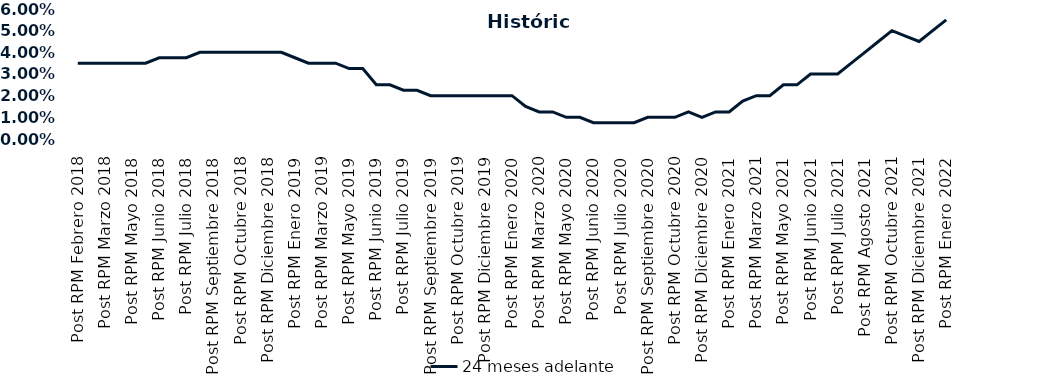
| Category | 24 meses adelante  |
|---|---|
| Post RPM Febrero 2018 | 0.035 |
| Pre RPM Marzo 2018 | 0.035 |
| Post RPM Marzo 2018 | 0.035 |
| Pre RPM Mayo 2018 | 0.035 |
| Post RPM Mayo 2018 | 0.035 |
| Pre RPM Junio 2018 | 0.035 |
| Post RPM Junio 2018 | 0.038 |
| Pre RPM Julio 2018 | 0.038 |
| Post RPM Julio 2018 | 0.038 |
| Pre RPM Septiembre 2018 | 0.04 |
| Post RPM Septiembre 2018 | 0.04 |
| Pre RPM Octubre 2018 | 0.04 |
| Post RPM Octubre 2018 | 0.04 |
| Pre RPM Diciembre 2018 | 0.04 |
| Post RPM Diciembre 2018 | 0.04 |
| Pre RPM Enero 2019 | 0.04 |
| Post RPM Enero 2019 | 0.038 |
| Pre RPM Marzo 2019 | 0.035 |
| Post RPM Marzo 2019 | 0.035 |
| Pre RPM Mayo 2019 | 0.035 |
| Post RPM Mayo 2019 | 0.032 |
| Pre RPM Junio 2019 | 0.032 |
| Post RPM Junio 2019 | 0.025 |
| Pre RPM Julio 2019 | 0.025 |
| Post RPM Julio 2019 | 0.022 |
| Pre RPM Septiembre 2019 | 0.022 |
| Post RPM Septiembre 2019 | 0.02 |
| Pre RPM Octubre 2019 | 0.02 |
| Post RPM Octubre 2019 | 0.02 |
| Pre RPM Diciembre 2019 | 0.02 |
| Post RPM Diciembre 2019 | 0.02 |
| Pre RPM Enero 2020 | 0.02 |
| Post RPM Enero 2020 | 0.02 |
| Pre RPM Marzo 2020 | 0.015 |
| Post RPM Marzo 2020 | 0.012 |
| Pre RPM Mayo 2020 | 0.012 |
| Post RPM Mayo 2020 | 0.01 |
| Pre RPM Junio 2020 | 0.01 |
| Post RPM Junio 2020 | 0.008 |
| Pre RPM Julio 2020 | 0.008 |
| Post RPM Julio 2020 | 0.008 |
| Pre RPM Septiembre 2020 | 0.008 |
| Post RPM Septiembre 2020 | 0.01 |
| Pre RPM Octubre 2020 | 0.01 |
| Post RPM Octubre 2020 | 0.01 |
| Pre RPM Diciembre 2020 | 0.012 |
| Post RPM Diciembre 2020 | 0.01 |
| Pre RPM Enero 2021 | 0.012 |
| Post RPM Enero 2021 | 0.012 |
| Pre RPM Marzo 2021 | 0.018 |
| Post RPM Marzo 2021 | 0.02 |
| Pre RPM Mayo 2021 | 0.02 |
| Post RPM Mayo 2021 | 0.025 |
| Pre RPM Junio 2021 | 0.025 |
| Post RPM Junio 2021 | 0.03 |
| Pre RPM Julio 2021 | 0.03 |
| Post RPM Julio 2021 | 0.03 |
| Pre RPM Agosto 2021 | 0.035 |
| Post RPM Agosto 2021 | 0.04 |
| Pre RPM Octubre 2021 | 0.045 |
| Post RPM Octubre 2021 | 0.05 |
| Pre RPM Diciembre 2021 | 0.048 |
| Post RPM Diciembre 2021 | 0.045 |
| Pre RPM Enero 2022 | 0.05 |
| Post RPM Enero 2022 | 0.055 |